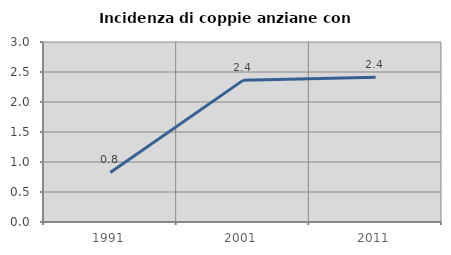
| Category | Incidenza di coppie anziane con figli |
|---|---|
| 1991.0 | 0.826 |
| 2001.0 | 2.361 |
| 2011.0 | 2.412 |